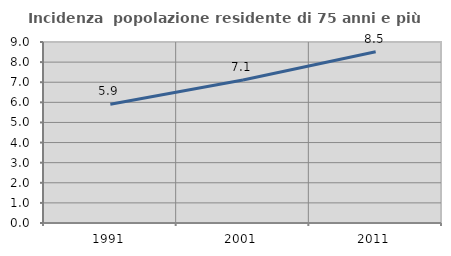
| Category | Incidenza  popolazione residente di 75 anni e più |
|---|---|
| 1991.0 | 5.906 |
| 2001.0 | 7.108 |
| 2011.0 | 8.515 |